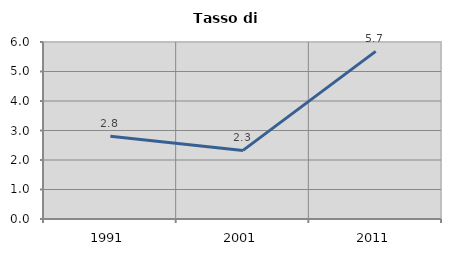
| Category | Tasso di disoccupazione   |
|---|---|
| 1991.0 | 2.806 |
| 2001.0 | 2.326 |
| 2011.0 | 5.681 |